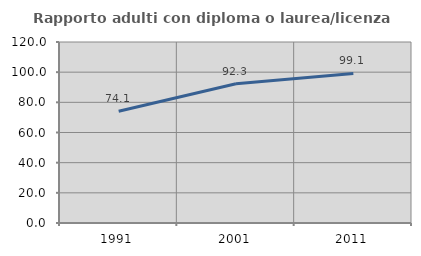
| Category | Rapporto adulti con diploma o laurea/licenza media  |
|---|---|
| 1991.0 | 74.138 |
| 2001.0 | 92.321 |
| 2011.0 | 99.14 |